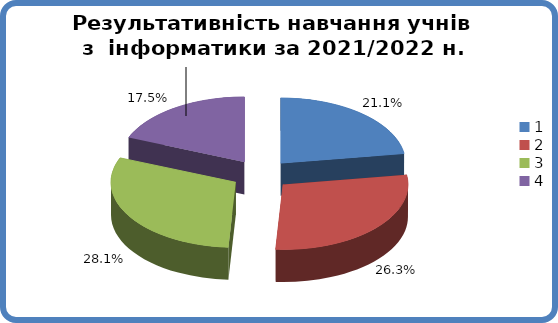
| Category | Series 0 |
|---|---|
| 0 | 0.211 |
| 1 | 0.263 |
| 2 | 0.281 |
| 3 | 0.175 |